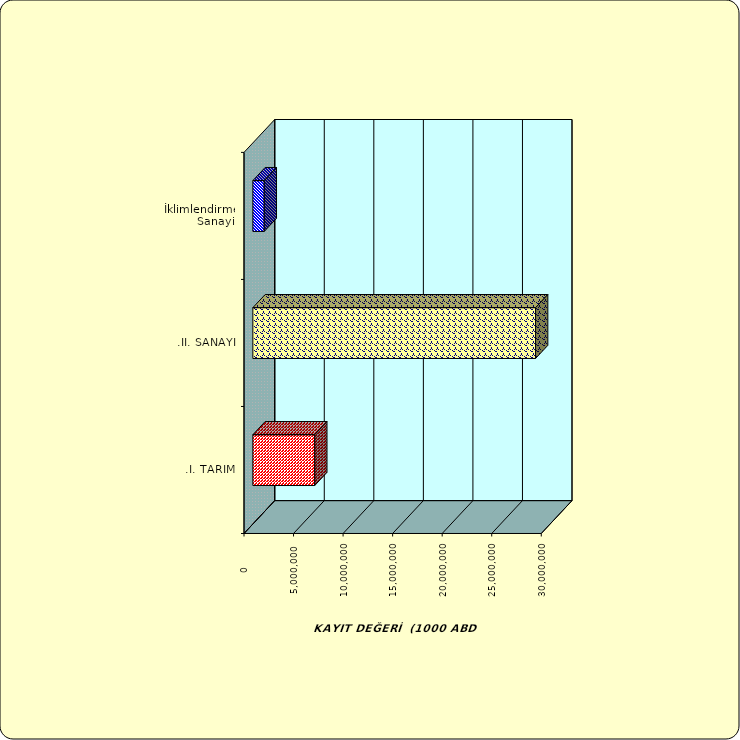
| Category | Series 0 |
|---|---|
| .I. TARIM | 6243578.203 |
| .II. SANAYİ | 28530982.443 |
|  İklimlendirme Sanayii | 1147487.413 |